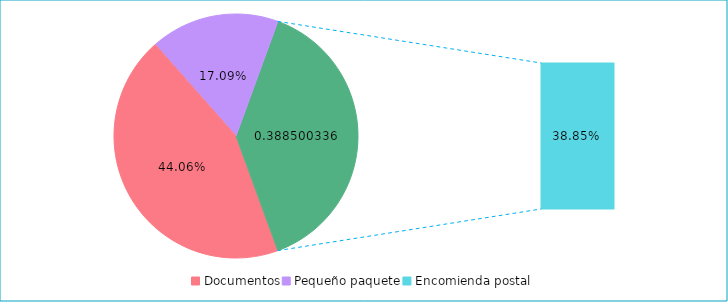
| Category | Series 0 |
|---|---|
| Documentos | 0.441 |
| Pequeño paquete | 0.171 |
| Encomienda postal | 0.389 |